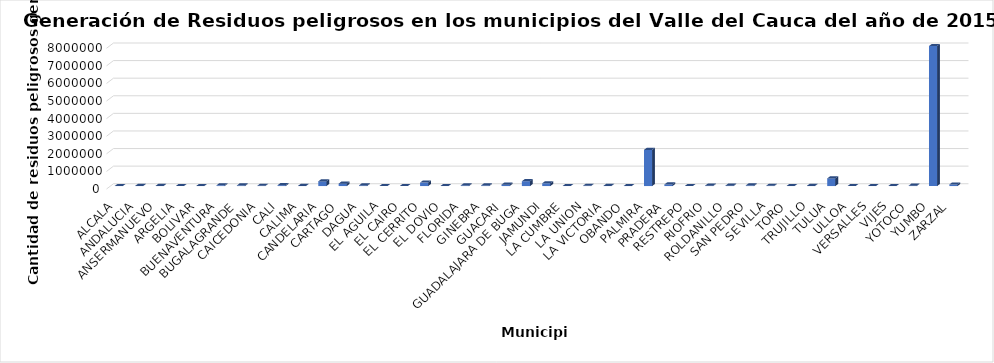
| Category | Series 0 |
|---|---|
| ALCALA | 3362 |
| ANDALUCIA | 5718.31 |
| ANSERMANUEVO | 4436.18 |
| ARGELIA | 1006.2 |
| BOLIVAR | 2531.7 |
| BUENAVENTURA | 43336.96 |
| BUGALAGRANDE | 33468.52 |
| CAICEDONIA | 14536.8 |
| CALI | 49212.74 |
| CALIMA | 6863.3 |
| CANDELARIA | 265378.63 |
| CARTAGO | 138057.67 |
| DAGUA | 37996.03 |
| EL AGUILA | 982 |
| EL CAIRO | 918.47 |
| EL CERRITO | 196908.71 |
| EL DOVIO | 1821.4 |
| FLORIDA | 36304.38 |
| GINEBRA | 35831.79 |
| GUACARI | 79204.3 |
| GUADALAJARA DE BUGA | 274442.14 |
| JAMUNDI | 157608.37 |
| LA CUMBRE | 1942.15 |
| LA UNION | 13316.88 |
| LA VICTORIA | 4786.1 |
| OBANDO | 3131 |
| PALMIRA | 2055648.03 |
| PRADERA | 89362.59 |
| RESTREPO | 540.6 |
| RIOFRIO | 21993.4 |
| ROLDANILLO | 23710.29 |
| SAN PEDRO | 34104.77 |
| SEVILLA | 16450.8 |
| TORO | 2091.8 |
| TRUJILLO | 8672.75 |
| TULUA | 434276.42 |
| ULLOA | 746 |
| VERSALLES | 1819.7 |
| VIJES | 2298.71 |
| YOTOCO | 20591.97 |
| YUMBO | 7959873.18 |
| ZARZAL | 88323.44 |